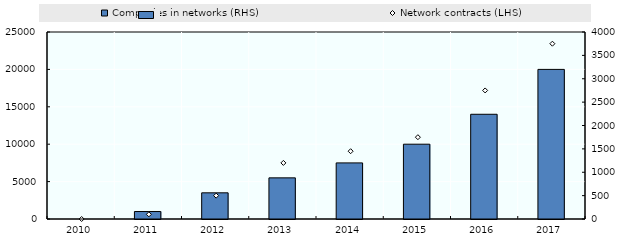
| Category | Companies in networks (RHS) |
|---|---|
| 2010.0 | 0 |
| 2011.0 | 1000 |
| 2012.0 | 3500 |
| 2013.0 | 5500 |
| 2014.0 | 7500 |
| 2015.0 | 10000 |
| 2016.0 | 14000 |
| 2017.0 | 20000 |